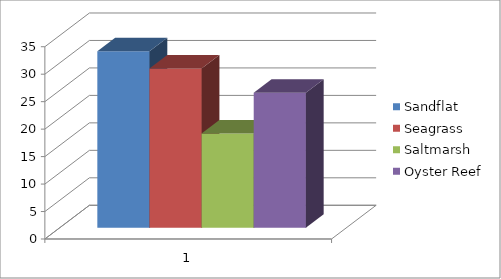
| Category | Sandflat | Seagrass | Saltmarsh | Oyster Reef |
|---|---|---|---|---|
| 0 | 32.143 | 29 | 17.143 | 24.571 |